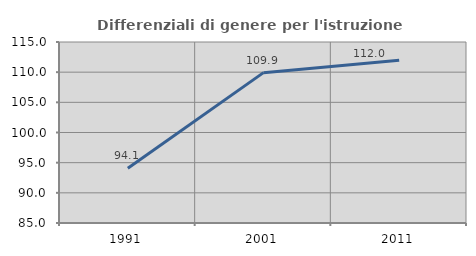
| Category | Differenziali di genere per l'istruzione superiore |
|---|---|
| 1991.0 | 94.082 |
| 2001.0 | 109.921 |
| 2011.0 | 111.971 |